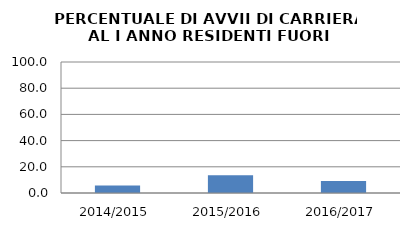
| Category | 2014/2015 2015/2016 2016/2017 |
|---|---|
| 2014/2015 | 5.714 |
| 2015/2016 | 13.559 |
| 2016/2017 | 9.091 |